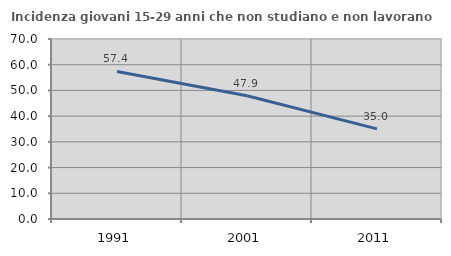
| Category | Incidenza giovani 15-29 anni che non studiano e non lavorano  |
|---|---|
| 1991.0 | 57.375 |
| 2001.0 | 47.934 |
| 2011.0 | 35.036 |